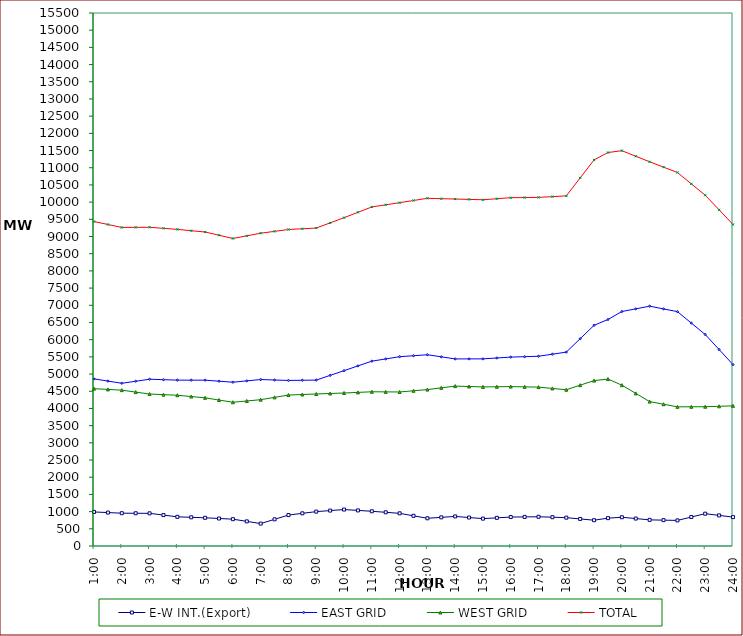
| Category | E-W INT.(Export) | EAST GRID | WEST GRID | TOTAL |
|---|---|---|---|---|
| 1:00 | 990 | 4860 | 4575 | 9435 |
| 1:30 | 972 | 4796 | 4553.5 | 9349.5 |
| 2:00 | 954 | 4732 | 4532 | 9264 |
| 2:30 | 952 | 4791 | 4475.5 | 9266.5 |
| 3:00 | 950 | 4850 | 4419 | 9269 |
| 3:30 | 899 | 4836.5 | 4401.5 | 9238 |
| 4:00 | 848 | 4823 | 4384 | 9207 |
| 4:30 | 834 | 4822.5 | 4346.5 | 9169 |
| 5:00 | 820 | 4822 | 4309 | 9131 |
| 5:30 | 800 | 4792.5 | 4244.5 | 9037 |
| 6:00 | 780 | 4763 | 4180 | 8943 |
| 6:30 | 716 | 4802 | 4217.5 | 9019.5 |
| 7:00 | 652 | 4841 | 4255 | 9096 |
| 7:30 | 776 | 4827.5 | 4322.5 | 9150 |
| 8:00 | 900 | 4814 | 4390 | 9204 |
| 8:30 | 950 | 4819.5 | 4405.5 | 9225 |
| 9:00 | 1000 | 4825 | 4421 | 9246 |
| 9:30 | 1030 | 4962 | 4435 | 9397 |
| 10:00 | 1060 | 5099 | 4449 | 9548 |
| 10:30 | 1035 | 5237 | 4467 | 9704 |
| 11:00 | 1010 | 5375 | 4485 | 9860 |
| 11:30 | 980 | 5440 | 4482 | 9922 |
| 12:00 | 950 | 5505 | 4479 | 9984 |
| 12:30 | 878 | 5533.5 | 4514 | 10047.5 |
| 13:00 | 806 | 5562 | 4549 | 10111 |
| 13:30 | 833 | 5501 | 4599.5 | 10100.5 |
| 14:00 | 860 | 5440 | 4650 | 10090 |
| 14:30 | 828 | 5441 | 4638.5 | 10079.5 |
| 15:00 | 796 | 5442 | 4627 | 10069 |
| 15:30 | 819 | 5467.5 | 4631.5 | 10099 |
| 16:00 | 842 | 5493 | 4636 | 10129 |
| 16:30 | 846 | 5505.5 | 4628 | 10133.5 |
| 17:00 | 850 | 5518 | 4620 | 10138 |
| 17:30 | 837 | 5578 | 4582 | 10160 |
| 18:00 | 824 | 5638 | 4544 | 10182 |
| 18:30 | 787 | 6028 | 4677 | 10705 |
| 19:00 | 750 | 6418 | 4810 | 11228 |
| 19:30 | 810 | 6587 | 4855 | 11442 |
| 20:00 | 836 | 6819 | 4677 | 11496 |
| 20:30 | 798 | 6896.5 | 4438 | 11334.5 |
| 21:00 | 760 | 6974 | 4199 | 11173 |
| 21:30 | 752 | 6894.5 | 4123 | 11017.5 |
| 22:00 | 744 | 6815 | 4047 | 10862 |
| 22:30 | 842 | 6483 | 4048.5 | 10531.5 |
| 23:00 | 940 | 6151 | 4050 | 10201 |
| 23:30 | 890 | 5713 | 4062.5 | 9775.5 |
| 24:00 | 840 | 5275 | 4075 | 9350 |